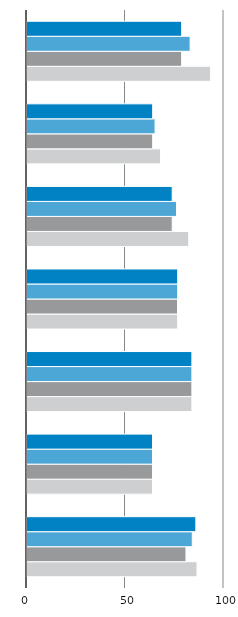
| Category | Summe von Maximum | Summe von Minimum | Summe von Deutschland | Summe von Anteil an den Beschäftigten insg. In % VZÄ |
|---|---|---|---|---|
| 7 | 86.3 | 80.7 | 83.9 | 85.7 |
| 6 | 63.7 | 63.7 | 63.7 | 63.7 |
| 5 | 83.7 | 83.7 | 83.7 | 83.7 |
| 4 | 76.5 | 76.4 | 76.5 | 76.5 |
| 3 | 82.1 | 73.7 | 75.9 | 73.7 |
| 2 | 67.8 | 63.8 | 65 | 63.8 |
| 1 | 93.2 | 78.5 | 82.8 | 78.5 |